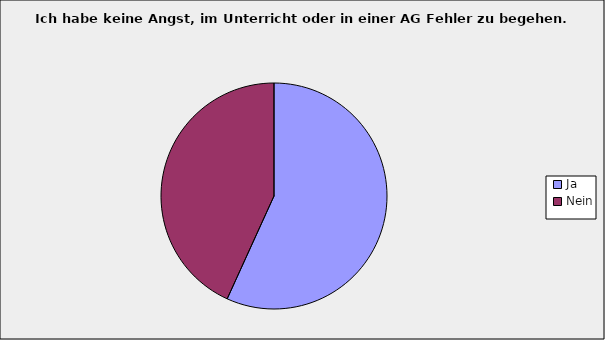
| Category | Series 0 |
|---|---|
| Ja | 0.568 |
| Nein | 0.432 |